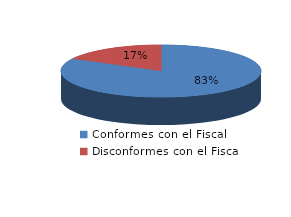
| Category | Series 0 |
|---|---|
| 0 | 2090 |
| 1 | 436 |